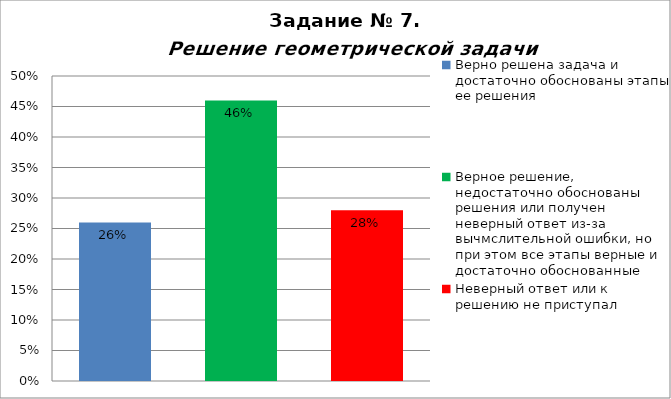
| Category | Решение геометрической задачи  |
|---|---|
| Верно решена задача и достаточно обоснованы этапы ее решения | 0.26 |
| Верное решение, недостаточно обоснованы решения или получен неверный ответ из-за вычмслительной ошибки, но при этом все этапы верные и достаточно обоснованные | 0.46 |
| Неверный ответ или к решению не приступал | 0.28 |